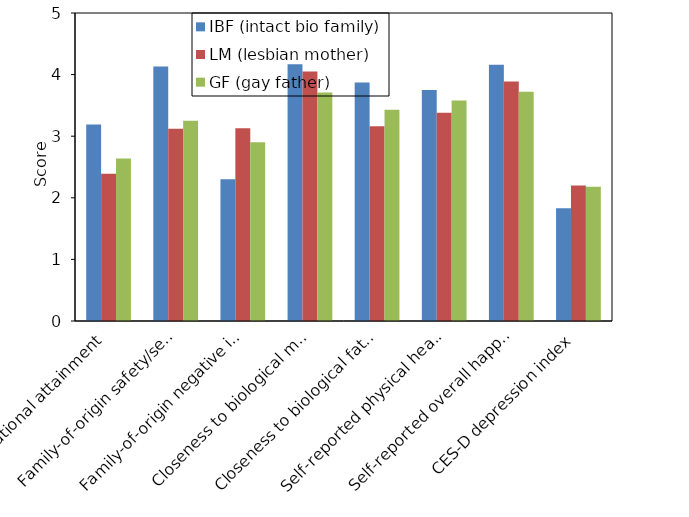
| Category | IBF (intact bio family) | LM (lesbian mother) | GF (gay father) |
|---|---|---|---|
| Educational attainment | 3.19 | 2.39 | 2.64 |
| Family-of-origin safety/security | 4.13 | 3.12 | 3.25 |
| Family-of-origin negative impact | 2.3 | 3.13 | 2.9 |
| Closeness to biological mother | 4.17 | 4.05 | 3.71 |
| Closeness to biological father | 3.87 | 3.16 | 3.43 |
| Self-reported physical health | 3.75 | 3.38 | 3.58 |
| Self-reported overall happiness | 4.16 | 3.89 | 3.72 |
| CES-D depression index | 1.83 | 2.2 | 2.18 |